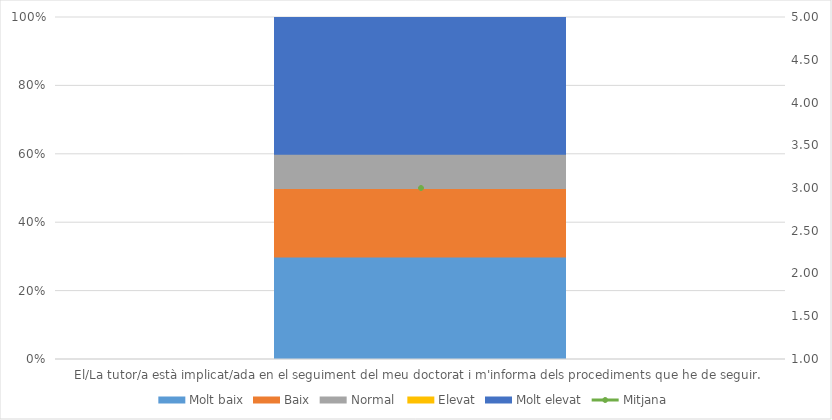
| Category | Molt baix | Baix | Normal  | Elevat | Molt elevat |
|---|---|---|---|---|---|
| El/La tutor/a està implicat/ada en el seguiment del meu doctorat i m'informa dels procediments que he de seguir.  | 3 | 2 | 1 | 0 | 4 |